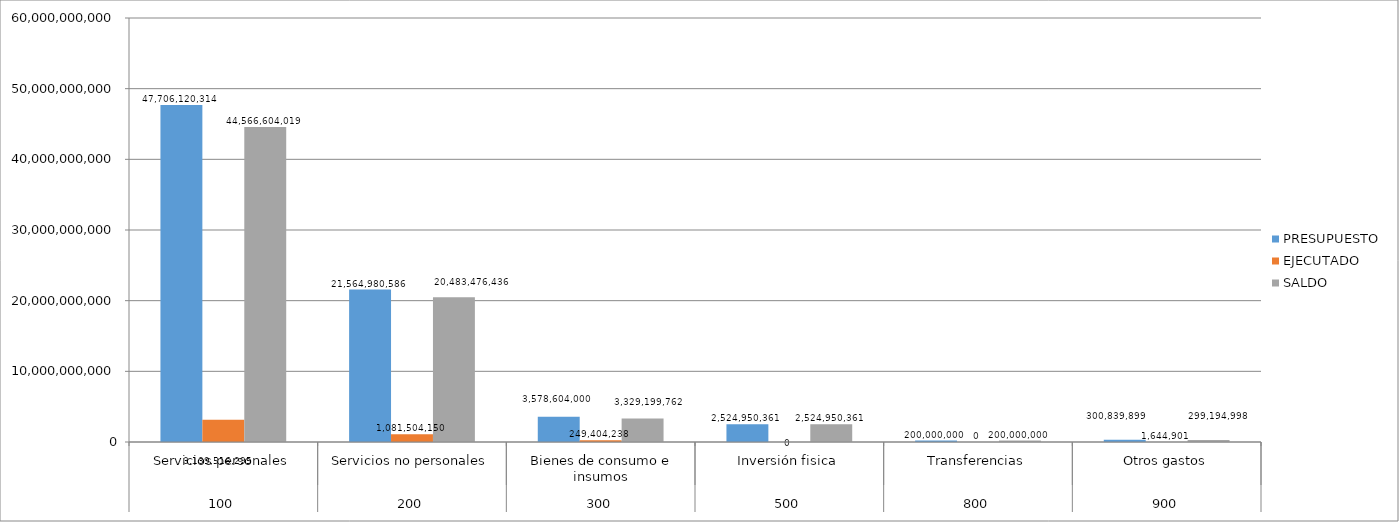
| Category | PRESUPUESTO | EJECUTADO | SALDO |
|---|---|---|---|
| 0 | 47706120314 | 3139516295 | 44566604019 |
| 1 | 21564980586 | 1081504150 | 20483476436 |
| 2 | 3578604000 | 249404238 | 3329199762 |
| 3 | 2524950361 | 0 | 2524950361 |
| 4 | 200000000 | 0 | 200000000 |
| 5 | 300839899 | 1644901 | 299194998 |